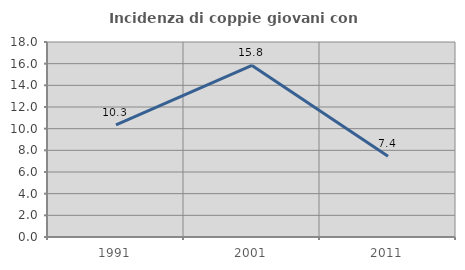
| Category | Incidenza di coppie giovani con figli |
|---|---|
| 1991.0 | 10.345 |
| 2001.0 | 15.842 |
| 2011.0 | 7.447 |